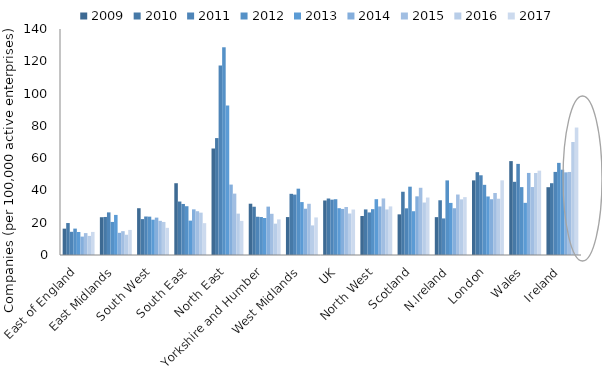
| Category | 2009 | 2010 | 2011 | 2012 | 2013 | 2014 | 2015 | 2016 | 2017 |
|---|---|---|---|---|---|---|---|---|---|
| East of England | 16.323 | 19.798 | 14.37 | 16.349 | 14.26 | 11.402 | 13.566 | 11.824 | 14.286 |
| East Midlands | 23.4 | 23.562 | 26.406 | 20.488 | 24.83 | 13.743 | 14.754 | 12.543 | 15.529 |
| South West | 28.977 | 22.239 | 23.848 | 23.756 | 21.871 | 23.158 | 21.17 | 20.471 | 16.813 |
| South East | 44.463 | 33.129 | 31.617 | 30.214 | 21.298 | 28.283 | 27.125 | 26.237 | 19.722 |
| North East | 65.975 | 72.424 | 117.386 | 128.678 | 92.579 | 43.621 | 38.023 | 25.636 | 21.116 |
| Yorkshire and Humber | 31.77 | 29.898 | 23.691 | 23.517 | 22.915 | 29.971 | 25.524 | 19.415 | 22.07 |
| West Midlands | 23.493 | 37.899 | 37.42 | 41.084 | 32.79 | 28.677 | 31.734 | 18.328 | 23.271 |
| UK | 33.776 | 35 | 34.278 | 34.556 | 28.994 | 28.539 | 29.753 | 25.688 | 28.166 |
| North West | 24.143 | 28.237 | 26.368 | 28.399 | 34.573 | 30.064 | 35.035 | 28.208 | 30.091 |
| Scotland | 25.178 | 39.179 | 28.91 | 42.319 | 27.122 | 36.34 | 41.645 | 32.505 | 35.596 |
| N.Ireland | 23.451 | 33.907 | 22.66 | 46.218 | 32.27 | 28.965 | 37.46 | 34.468 | 35.852 |
| London | 46.232 | 51.299 | 49.384 | 43.468 | 36.256 | 34.543 | 38.425 | 34.854 | 46.255 |
| Wales | 58.162 | 45.336 | 56.44 | 42.053 | 32.312 | 50.841 | 42.101 | 50.79 | 52.24 |
| Ireland | 42.004 | 44.471 | 51.47 | 57.07 | 52.848 | 51.207 | 51.438 | 69.991 | 78.956 |